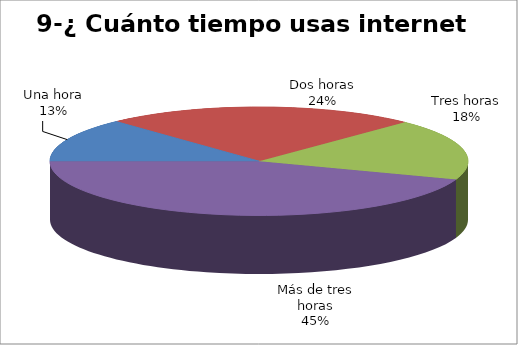
| Category | Series 0 |
|---|---|
| Una hora | 43 |
| Dos horas | 80 |
| Tres horas | 60 |
| Más de tres horas | 147 |